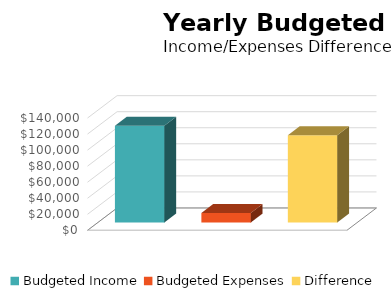
| Category | Series 0 |
|---|---|
| Budgeted Income | 120600 |
| Budgeted Expenses | 11800 |
| Difference | 108800 |